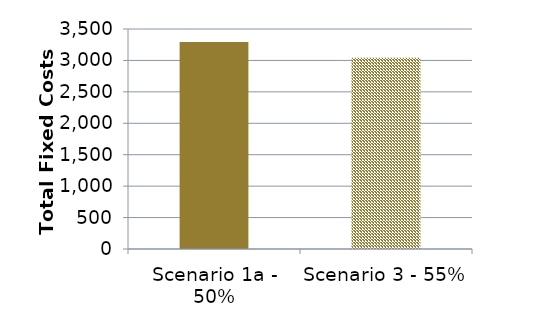
| Category | Series 1 |
|---|---|
| 0 | 3291.529 |
| 1 | 3043.954 |